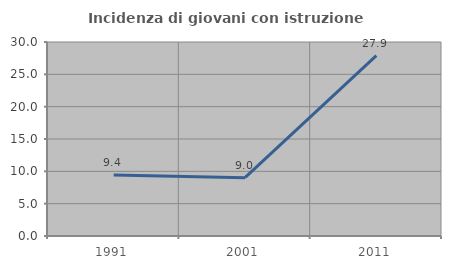
| Category | Incidenza di giovani con istruzione universitaria |
|---|---|
| 1991.0 | 9.434 |
| 2001.0 | 9.023 |
| 2011.0 | 27.885 |